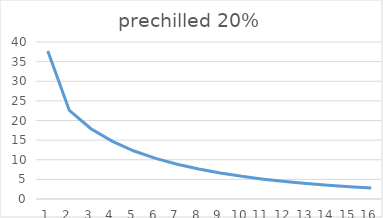
| Category | Series 0 |
|---|---|
| 0 | 37.7 |
| 1 | 22.567 |
| 2 | 17.896 |
| 3 | 14.676 |
| 4 | 12.226 |
| 5 | 10.336 |
| 6 | 8.863 |
| 7 | 7.648 |
| 8 | 6.629 |
| 9 | 5.776 |
| 10 | 5.06 |
| 11 | 4.455 |
| 12 | 3.938 |
| 13 | 3.502 |
| 14 | 3.123 |
| 15 | 2.798 |